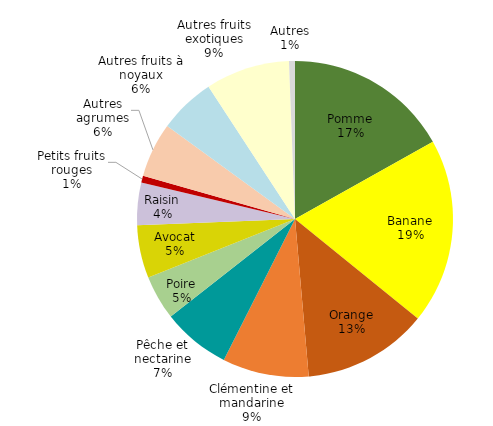
| Category | Series 0 |
|---|---|
| Pomme | 0.169 |
| Banane | 0.189 |
| Orange | 0.128 |
| Clémentine et mandarine | 0.088 |
| Pêche et nectarine | 0.07 |
| Poire | 0.045 |
| Avocat | 0.054 |
| Raisin | 0.043 |
| Petits fruits rouges | 0.007 |
| Autres agrumes | 0.056 |
| Autres fruits à noyaux | 0.058 |
| Autres fruits exotiques | 0.086 |
| Autres | 0.006 |